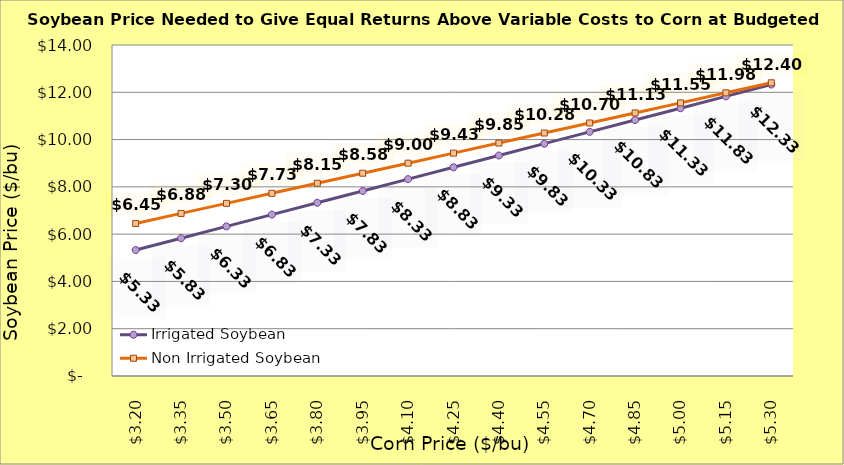
| Category | Irrigated Soybean | Non Irrigated Soybean |
|---|---|---|
| 3.2 | 5.327 | 6.452 |
| 3.35 | 5.827 | 6.877 |
| 3.5 | 6.327 | 7.302 |
| 3.65 | 6.827 | 7.727 |
| 3.8 | 7.327 | 8.152 |
| 3.9499999999999997 | 7.827 | 8.577 |
| 4.1 | 8.327 | 9.002 |
| 4.25 | 8.827 | 9.427 |
| 4.4 | 9.327 | 9.852 |
| 4.550000000000001 | 9.827 | 10.277 |
| 4.700000000000001 | 10.327 | 10.702 |
| 4.850000000000001 | 10.827 | 11.127 |
| 5.000000000000002 | 11.327 | 11.552 |
| 5.150000000000002 | 11.827 | 11.977 |
| 5.3000000000000025 | 12.327 | 12.402 |